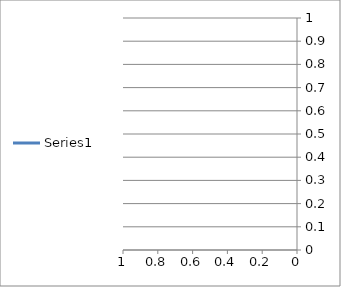
| Category | Series 0 |
|---|---|
| 0 | 0 |
| 1 | 0 |
| 2 | 0 |
| 3 | 0 |
| 4 | 0 |
| 5 | 0 |
| 6 | 0 |
| 7 | 0 |
| 8 | 0 |
| 9 | 0 |
| 10 | 0 |
| 11 | 0 |
| 12 | 0 |
| 13 | 0 |
| 14 | 0 |
| 15 | 0 |
| 16 | 0 |
| 17 | 0 |
| 18 | 0 |
| 19 | 0 |
| 20 | 0 |
| 21 | 0 |
| 22 | 0 |
| 23 | 0 |
| 24 | 0 |
| 25 | 0 |
| 26 | 0 |
| 27 | 0 |
| 28 | 0 |
| 29 | 0 |
| 30 | 0 |
| 31 | 0 |
| 32 | 0 |
| 33 | 0 |
| 34 | 0 |
| 35 | 0 |
| 36 | 0 |
| 37 | 0 |
| 38 | 0 |
| 39 | 0 |
| 40 | 0 |
| 41 | 0 |
| 42 | 0 |
| 43 | 0 |
| 44 | 0 |
| 45 | 0 |
| 46 | 0 |
| 47 | 0 |
| 48 | 0 |
| 49 | 0 |
| 50 | 0 |
| 51 | 0 |
| 52 | 0 |
| 53 | 0 |
| 54 | 0 |
| 55 | 0 |
| 56 | 0 |
| 57 | 0 |
| 58 | 0 |
| 59 | 0 |
| 60 | 0 |
| 61 | 0 |
| 62 | 0 |
| 63 | 0 |
| 64 | 0 |
| 65 | 0 |
| 66 | 0 |
| 67 | 0 |
| 68 | 0 |
| 69 | 0 |
| 70 | 0 |
| 71 | 0 |
| 72 | 0 |
| 73 | 0 |
| 74 | 0 |
| 75 | 0 |
| 76 | 0 |
| 77 | 0 |
| 78 | 0 |
| 79 | 0 |
| 80 | 0 |
| 81 | 0 |
| 82 | 0 |
| 83 | 0 |
| 84 | 0 |
| 85 | 0 |
| 86 | 0 |
| 87 | 0 |
| 88 | 0 |
| 89 | 0 |
| 90 | 0 |
| 91 | 0 |
| 92 | 0 |
| 93 | 0 |
| 94 | 0 |
| 95 | 0 |
| 96 | 0 |
| 97 | 0 |
| 98 | 0 |
| 99 | 0 |
| 100 | 0 |
| 101 | 0 |
| 102 | 0 |
| 103 | 0 |
| 104 | 0 |
| 105 | 0 |
| 106 | 0 |
| 107 | 0 |
| 108 | 0 |
| 109 | 0 |
| 110 | 0 |
| 111 | 0 |
| 112 | 0 |
| 113 | 0 |
| 114 | 0 |
| 115 | 0 |
| 116 | 0 |
| 117 | 0 |
| 118 | 0 |
| 119 | 0 |
| 120 | 0 |
| 121 | 0 |
| 122 | 0 |
| 123 | 0 |
| 124 | 0 |
| 125 | 0 |
| 126 | 0 |
| 127 | 0 |
| 128 | 0 |
| 129 | 0 |
| 130 | 0 |